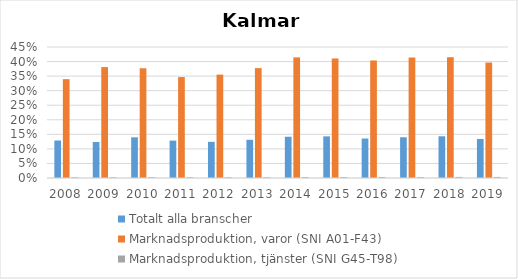
| Category | Totalt alla branscher | Marknadsproduktion, varor (SNI A01-F43) | Marknadsproduktion, tjänster (SNI G45-T98) |
|---|---|---|---|
| 2008 | 0.129 | 0.339 | 0.003 |
| 2009 | 0.124 | 0.381 | 0.003 |
| 2010 | 0.14 | 0.377 | 0.003 |
| 2011 | 0.128 | 0.347 | 0.003 |
| 2012 | 0.124 | 0.355 | 0.003 |
| 2013 | 0.131 | 0.377 | 0.003 |
| 2014 | 0.142 | 0.414 | 0.003 |
| 2015 | 0.143 | 0.411 | 0.003 |
| 2016 | 0.136 | 0.404 | 0.003 |
| 2017 | 0.14 | 0.414 | 0.003 |
| 2018 | 0.143 | 0.415 | 0.004 |
| 2019 | 0.134 | 0.397 | 0.004 |